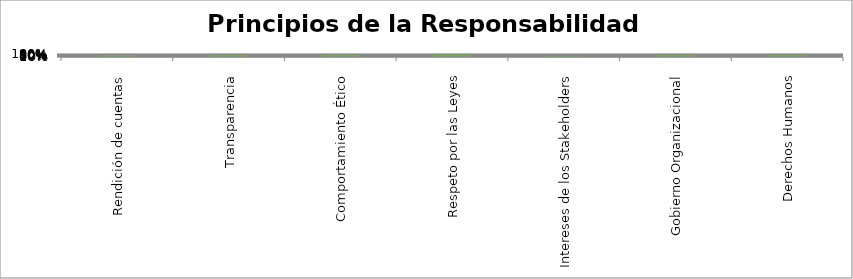
| Category | Principios de la Responsabilidad social |
|---|---|
| Rendición de cuentas | 0.4 |
| Transparencia | 0.571 |
| Comportamiento Ético | 0.692 |
| Respeto por las Leyes | 0.875 |
| Intereses de los Stakeholders | 0.308 |
| Gobierno Organizacional | 0.571 |
| Derechos Humanos | 0.559 |